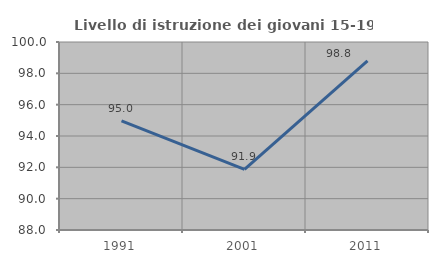
| Category | Livello di istruzione dei giovani 15-19 anni |
|---|---|
| 1991.0 | 94.964 |
| 2001.0 | 91.87 |
| 2011.0 | 98.795 |